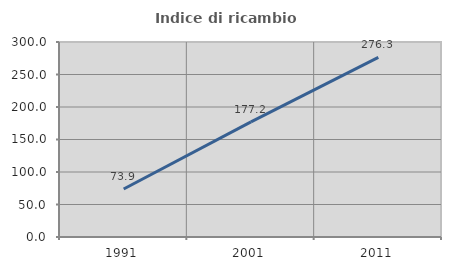
| Category | Indice di ricambio occupazionale  |
|---|---|
| 1991.0 | 73.864 |
| 2001.0 | 177.193 |
| 2011.0 | 276.271 |